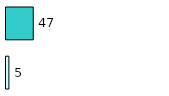
| Category | Series 0 | Series 1 |
|---|---|---|
| 0 | 5 | 47 |